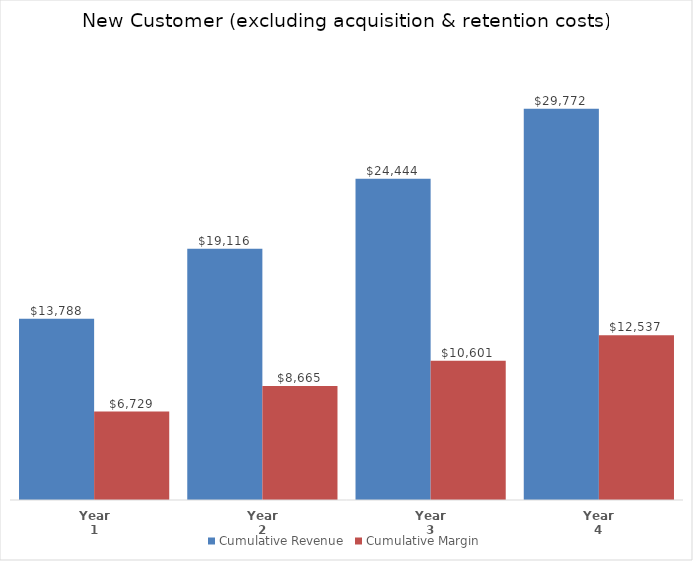
| Category | Cumulative Revenue | Cumulative Margin |
|---|---|---|
| Year 1 | 13788 | 6729.173 |
| Year 2 | 19116 | 8665.013 |
| Year 3 | 24444 | 10600.853 |
| Year 4 | 29772 | 12536.693 |